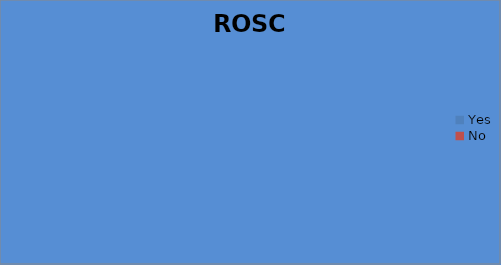
| Category | ROSC |
|---|---|
| Yes | 0 |
| No | 0 |